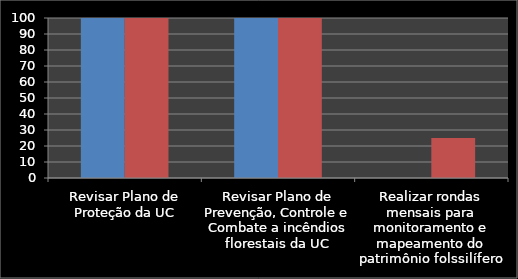
| Category | Inicio % | % |
|---|---|---|
| Revisar Plano de Proteção da UC | 100 | 100 |
| Revisar Plano de Prevenção, Controle e Combate a incêndios florestais da UC | 100 | 100 |
| Realizar rondas mensais para monitoramento e mapeamento do patrimônio folssilífero | 0 | 25 |